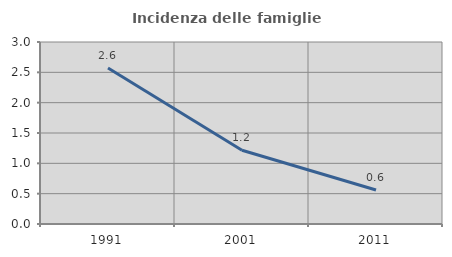
| Category | Incidenza delle famiglie numerose |
|---|---|
| 1991.0 | 2.572 |
| 2001.0 | 1.216 |
| 2011.0 | 0.56 |